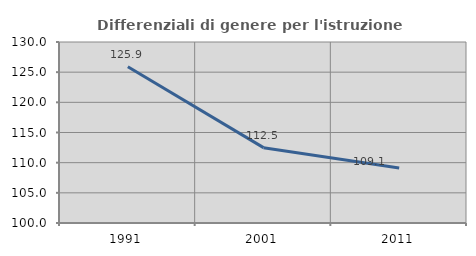
| Category | Differenziali di genere per l'istruzione superiore |
|---|---|
| 1991.0 | 125.888 |
| 2001.0 | 112.489 |
| 2011.0 | 109.101 |